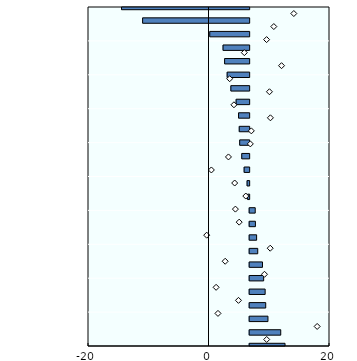
| Category | Real IRRs |
|---|---|
| Egypt | 8.807 |
| Uganda | 7.736 |
| North Macedonia | 4.553 |
| Indonesia | 3.997 |
| Uruguay | 3.856 |
| Maldives | 3.486 |
| Kosovo | 3.195 |
| Thailand | 2.01 |
| Kazakhstan | 1.732 |
| India | 1.432 |
| Croatia | 1.385 |
| Albania | -0.389 |
| Macau (China) | -0.518 |
| Guyana | -1.252 |
| Romania | -1.845 |
| Peru | -2.357 |
| Bulgaria | -2.47 |
| Hong Kong (China) | -2.641 |
| Georgia | -3.244 |
| Armenia | -4.556 |
| Nigeria | -5.478 |
| Serbia | -6.114 |
| Pakistan | -6.506 |
| Ghana | -9.811 |
| Suriname | -26.527 |
| Zimbabwe | -31.779 |